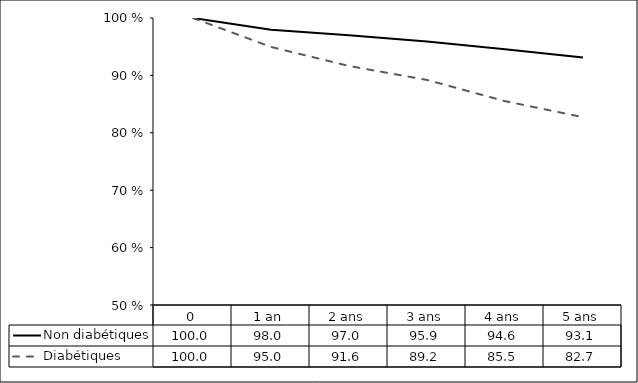
| Category | Non diabétiques | Diabétiques |
|---|---|---|
| 0 | 100 | 100 |
| 1 an | 97.973 | 94.959 |
| 2 ans | 96.975 | 91.64 |
| 3 ans | 95.921 | 89.209 |
| 4 ans | 94.564 | 85.514 |
| 5 ans | 93.102 | 82.728 |